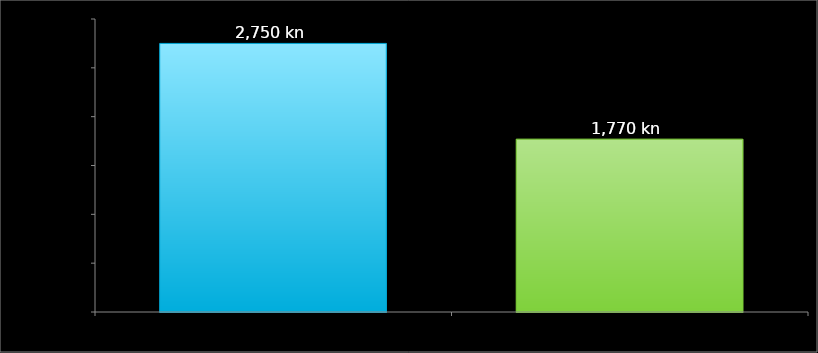
| Category | Podaci |
|---|---|
| prihod | 2750 |
| troškovi | 1770 |